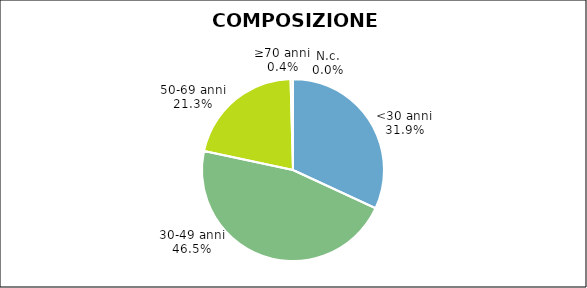
| Category | Series 0 |
|---|---|
| <30 anni | 19106 |
| 30-49 anni | 27805 |
| 50-69 anni | 12711 |
| ≥70 anni | 252 |
| N.c. | 6 |